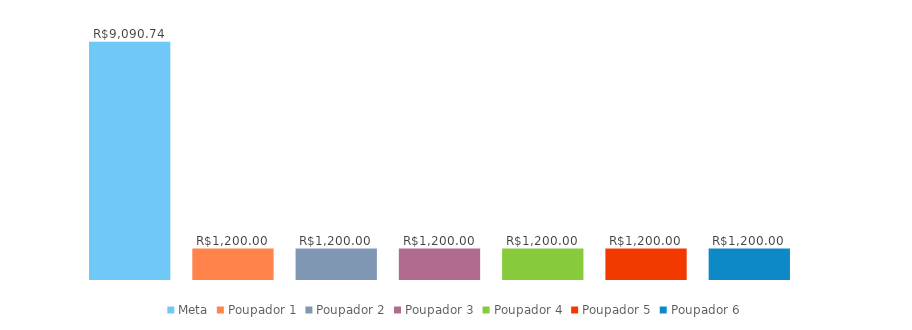
| Category | Meta | Poupador 1 | Poupador 2 | Poupador 3 | Poupador 4 | Poupador 5 | Poupador 6 |
|---|---|---|---|---|---|---|---|
| 0 | 9090.743 | 1200 | 1200 | 1200 | 1200 | 1200 | 1200 |